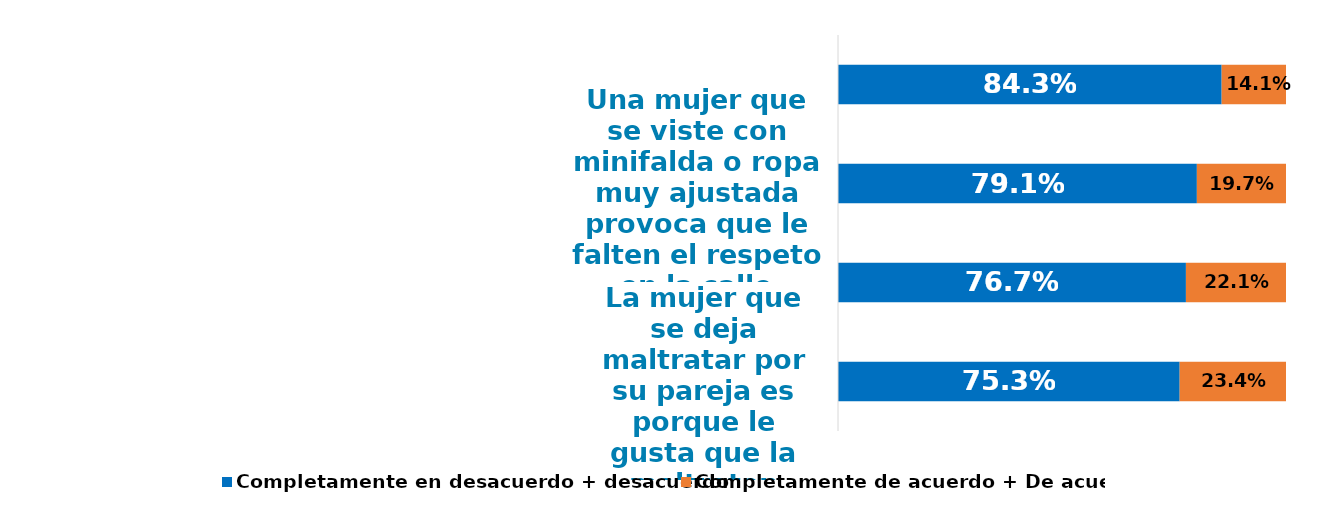
| Category | Completamente en desacuerdo + desacuerdo | Completamente de acuerdo + De acuerdo |
|---|---|---|
| La mujer que se deja maltratar por su pareja es porque le gusta que la maltraten | 0.753 | 0.234 |
| Lo más grave de que un hombre maltrate a su pareja es que lo haga en público | 0.767 | 0.221 |
| Una mujer que se viste con minifalda o ropa muy ajustada provoca que le falten el respeto en la calle | 0.791 | 0.197 |
| Desde que las mujeres comenzaron a trabajar, los valores familiares se empezaron a perder | 0.843 | 0.141 |